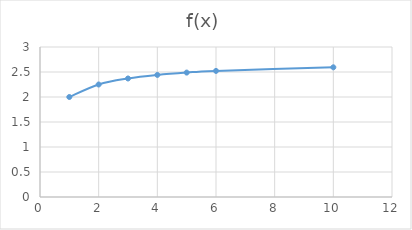
| Category | f(x) |
|---|---|
| 1.0 | 2 |
| 2.0 | 2.25 |
| 3.0 | 2.37 |
| 4.0 | 2.441 |
| 5.0 | 2.488 |
| 6.0 | 2.522 |
| 10.0 | 2.594 |